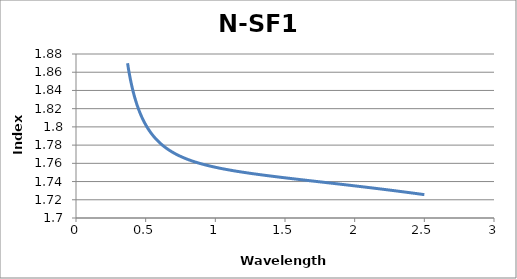
| Category | N-SF11 |
|---|---|
| 0.37 | 1.87 |
| 0.38 | 1.861 |
| 0.39 | 1.852 |
| 0.4 | 1.845 |
| 0.41 | 1.839 |
| 0.42 | 1.833 |
| 0.43 | 1.828 |
| 0.44 | 1.823 |
| 0.45 | 1.819 |
| 0.46 | 1.815 |
| 0.47 | 1.812 |
| 0.48 | 1.808 |
| 0.49 | 1.805 |
| 0.5 | 1.802 |
| 0.51 | 1.8 |
| 0.52 | 1.797 |
| 0.53 | 1.795 |
| 0.54 | 1.793 |
| 0.55 | 1.791 |
| 0.56 | 1.789 |
| 0.57 | 1.787 |
| 0.58 | 1.786 |
| 0.59 | 1.784 |
| 0.6 | 1.783 |
| 0.61 | 1.781 |
| 0.62 | 1.78 |
| 0.63 | 1.779 |
| 0.64 | 1.778 |
| 0.65 | 1.776 |
| 0.66 | 1.775 |
| 0.67 | 1.774 |
| 0.68 | 1.773 |
| 0.69 | 1.772 |
| 0.7 | 1.772 |
| 0.71 | 1.771 |
| 0.72 | 1.77 |
| 0.73 | 1.769 |
| 0.74 | 1.768 |
| 0.75 | 1.768 |
| 0.76 | 1.767 |
| 0.77 | 1.766 |
| 0.78 | 1.766 |
| 0.79 | 1.765 |
| 0.8 | 1.764 |
| 0.81 | 1.764 |
| 0.82 | 1.763 |
| 0.83 | 1.763 |
| 0.84 | 1.762 |
| 0.85 | 1.762 |
| 0.86 | 1.761 |
| 0.87 | 1.761 |
| 0.88 | 1.76 |
| 0.89 | 1.76 |
| 0.9 | 1.759 |
| 0.91 | 1.759 |
| 0.92 | 1.759 |
| 0.93 | 1.758 |
| 0.940000000000001 | 1.758 |
| 0.950000000000001 | 1.757 |
| 0.960000000000001 | 1.757 |
| 0.970000000000001 | 1.757 |
| 0.980000000000001 | 1.756 |
| 0.990000000000001 | 1.756 |
| 1.0 | 1.756 |
| 1.01 | 1.755 |
| 1.02 | 1.755 |
| 1.03 | 1.755 |
| 1.04 | 1.754 |
| 1.05 | 1.754 |
| 1.06 | 1.754 |
| 1.07 | 1.754 |
| 1.08 | 1.753 |
| 1.09 | 1.753 |
| 1.1 | 1.753 |
| 1.11 | 1.752 |
| 1.12 | 1.752 |
| 1.13 | 1.752 |
| 1.14 | 1.752 |
| 1.15 | 1.751 |
| 1.16 | 1.751 |
| 1.17 | 1.751 |
| 1.18 | 1.751 |
| 1.19 | 1.75 |
| 1.2 | 1.75 |
| 1.21 | 1.75 |
| 1.22 | 1.75 |
| 1.23 | 1.75 |
| 1.24 | 1.749 |
| 1.25 | 1.749 |
| 1.26 | 1.749 |
| 1.27 | 1.749 |
| 1.28 | 1.748 |
| 1.29 | 1.748 |
| 1.3 | 1.748 |
| 1.31 | 1.748 |
| 1.32 | 1.748 |
| 1.33 | 1.747 |
| 1.34 | 1.747 |
| 1.35 | 1.747 |
| 1.36 | 1.747 |
| 1.37 | 1.747 |
| 1.38 | 1.746 |
| 1.39 | 1.746 |
| 1.4 | 1.746 |
| 1.41 | 1.746 |
| 1.42 | 1.746 |
| 1.43 | 1.745 |
| 1.44 | 1.745 |
| 1.45 | 1.745 |
| 1.46 | 1.745 |
| 1.47 | 1.745 |
| 1.48 | 1.744 |
| 1.49 | 1.744 |
| 1.5 | 1.744 |
| 1.51 | 1.744 |
| 1.52 | 1.744 |
| 1.53 | 1.744 |
| 1.54 | 1.743 |
| 1.55 | 1.743 |
| 1.56 | 1.743 |
| 1.57 | 1.743 |
| 1.58 | 1.743 |
| 1.59 | 1.742 |
| 1.6 | 1.742 |
| 1.61 | 1.742 |
| 1.62 | 1.742 |
| 1.63 | 1.742 |
| 1.64 | 1.742 |
| 1.65 | 1.741 |
| 1.66 | 1.741 |
| 1.67 | 1.741 |
| 1.68 | 1.741 |
| 1.69 | 1.741 |
| 1.7 | 1.741 |
| 1.71 | 1.74 |
| 1.72 | 1.74 |
| 1.73 | 1.74 |
| 1.74 | 1.74 |
| 1.75 | 1.74 |
| 1.76 | 1.74 |
| 1.77 | 1.739 |
| 1.78 | 1.739 |
| 1.79 | 1.739 |
| 1.8 | 1.739 |
| 1.81 | 1.739 |
| 1.82 | 1.738 |
| 1.83 | 1.738 |
| 1.84 | 1.738 |
| 1.85 | 1.738 |
| 1.86 | 1.738 |
| 1.87 | 1.738 |
| 1.88 | 1.737 |
| 1.89 | 1.737 |
| 1.9 | 1.737 |
| 1.91 | 1.737 |
| 1.92 | 1.737 |
| 1.93 | 1.737 |
| 1.94 | 1.736 |
| 1.95 | 1.736 |
| 1.96 | 1.736 |
| 1.97 | 1.736 |
| 1.98 | 1.736 |
| 1.99 | 1.735 |
| 2.0 | 1.735 |
| 2.01 | 1.735 |
| 2.02 | 1.735 |
| 2.03 | 1.735 |
| 2.04 | 1.735 |
| 2.05 | 1.734 |
| 2.06 | 1.734 |
| 2.07 | 1.734 |
| 2.08 | 1.734 |
| 2.09 | 1.734 |
| 2.1 | 1.733 |
| 2.11 | 1.733 |
| 2.12 | 1.733 |
| 2.13 | 1.733 |
| 2.14 | 1.733 |
| 2.15 | 1.733 |
| 2.16 | 1.732 |
| 2.17 | 1.732 |
| 2.18 | 1.732 |
| 2.19 | 1.732 |
| 2.2 | 1.732 |
| 2.21 | 1.731 |
| 2.22 | 1.731 |
| 2.23 | 1.731 |
| 2.24 | 1.731 |
| 2.25 | 1.731 |
| 2.26 | 1.73 |
| 2.27 | 1.73 |
| 2.28 | 1.73 |
| 2.29 | 1.73 |
| 2.3 | 1.73 |
| 2.31 | 1.729 |
| 2.32 | 1.729 |
| 2.33 | 1.729 |
| 2.34 | 1.729 |
| 2.35 | 1.729 |
| 2.36 | 1.728 |
| 2.37 | 1.728 |
| 2.38 | 1.728 |
| 2.39 | 1.728 |
| 2.4 | 1.728 |
| 2.41 | 1.727 |
| 2.42 | 1.727 |
| 2.43 | 1.727 |
| 2.44 | 1.727 |
| 2.45 | 1.727 |
| 2.46 | 1.726 |
| 2.47 | 1.726 |
| 2.48 | 1.726 |
| 2.49 | 1.726 |
| 2.5 | 1.726 |